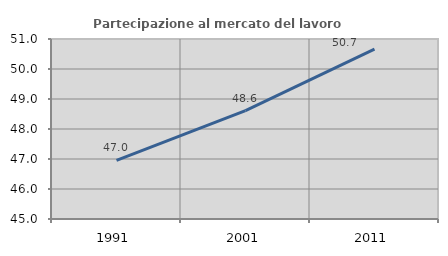
| Category | Partecipazione al mercato del lavoro  femminile |
|---|---|
| 1991.0 | 46.951 |
| 2001.0 | 48.613 |
| 2011.0 | 50.662 |